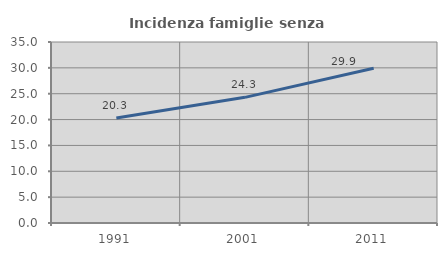
| Category | Incidenza famiglie senza nuclei |
|---|---|
| 1991.0 | 20.321 |
| 2001.0 | 24.296 |
| 2011.0 | 29.935 |